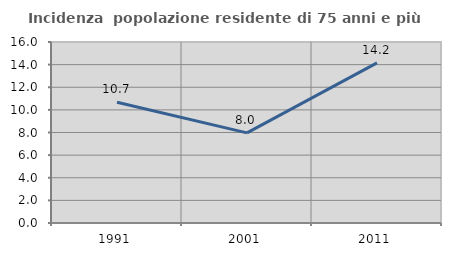
| Category | Incidenza  popolazione residente di 75 anni e più |
|---|---|
| 1991.0 | 10.68 |
| 2001.0 | 7.966 |
| 2011.0 | 14.155 |